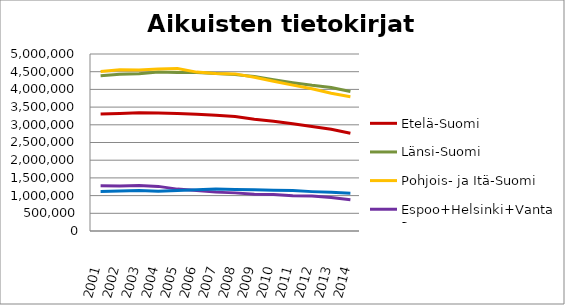
| Category | Etelä-Suomi | Länsi-Suomi | Pohjois- ja Itä-Suomi | Espoo+Helsinki+Vantaa | Muu Uusimaa |
|---|---|---|---|---|---|
| 2001.0 | 3304680 | 4387445 | 4504918 | 1281545 | 1116863 |
| 2002.0 | 3316488 | 4428846 | 4556510 | 1274381 | 1127511 |
| 2003.0 | 3337876 | 4443455 | 4548106 | 1282900 | 1142248 |
| 2004.0 | 3335597 | 4494809 | 4575421 | 1260308 | 1121285 |
| 2005.0 | 3320398 | 4475464 | 4590575 | 1183091 | 1143346 |
| 2006.0 | 3296018 | 4479008 | 4488558 | 1142626 | 1165381 |
| 2007.0 | 3269904 | 4448597 | 4447801 | 1098164 | 1186545 |
| 2008.0 | 3234418 | 4417457 | 4438337 | 1076972 | 1171636 |
| 2009.0 | 3158489 | 4367577 | 4343369 | 1041624 | 1162430 |
| 2010.0 | 3099036 | 4273917 | 4232055 | 1027858 | 1148277 |
| 2011.0 | 3026899 | 4189915 | 4121090 | 999175 | 1142555 |
| 2012.0 | 2952840 | 4114892 | 4019812 | 990785 | 1112264 |
| 2013.0 | 2873546 | 4055474 | 3891572 | 945721 | 1091804 |
| 2014.0 | 2763883 | 3942990 | 3794176 | 881497 | 1063957 |